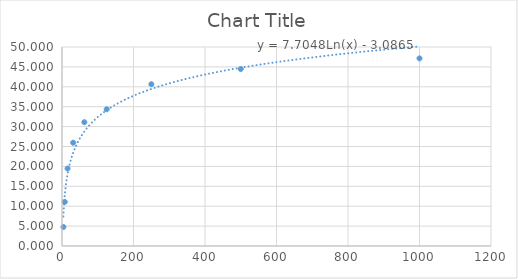
| Category | Series 0 |
|---|---|
| 3.91 | 4.771 |
| 7.81 | 11.069 |
| 15.62 | 19.466 |
| 31.25 | 25.954 |
| 62.5 | 31.107 |
| 125.0 | 34.351 |
| 250.0 | 40.649 |
| 500.0 | 44.466 |
| 1000.0 | 47.137 |